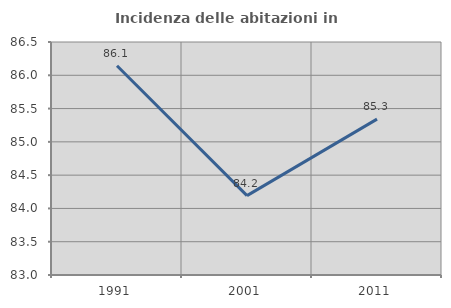
| Category | Incidenza delle abitazioni in proprietà  |
|---|---|
| 1991.0 | 86.142 |
| 2001.0 | 84.192 |
| 2011.0 | 85.342 |